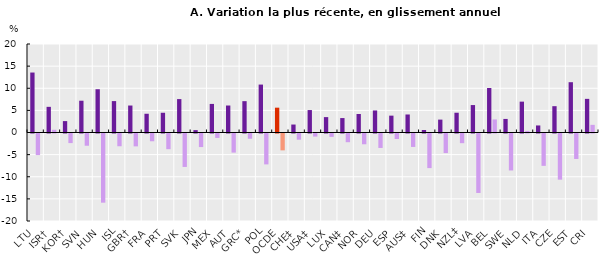
| Category | Salaire horaire nominal | Salaire horaire réel |
|---|---|---|
| LTU | 13.552 | -4.882 |
| ISR† | 5.798 | 0.612 |
| KOR† | 2.577 | -2.166 |
| SVN | 7.183 | -2.766 |
| HUN | 9.777 | -15.632 |
| ISL | 7.099 | -2.883 |
| GBR† | 6.096 | -2.909 |
| FRA | 4.235 | -1.755 |
| PRT | 4.462 | -3.547 |
| SVK | 7.551 | -7.557 |
| JPN | 0.54 | -3.065 |
| MEX | 6.46 | -0.997 |
| AUT | 6.099 | -4.316 |
| GRC* | 7.084 | -1.188 |
| POL | 10.832 | -6.979 |
| OCDE | 5.61 | -3.81 |
| CHE‡ | 1.8 | -1.399 |
| USA‡ | 5.072 | -0.697 |
| LUX | 3.477 | -0.762 |
| CAN‡ | 3.262 | -1.967 |
| NOR | 4.183 | -2.434 |
| DEU | 4.98 | -3.267 |
| ESP | 3.809 | -1.245 |
| AUS‡ | 4.071 | -3.037 |
| FIN | 0.57 | -7.819 |
| DNK | 2.913 | -4.422 |
| NZL‡ | 4.467 | -2.188 |
| LVA | 6.201 | -13.44 |
| BEL | 10.057 | 2.95 |
| SWE | 3.065 | -8.353 |
| NLD | 6.974 | 0.355 |
| ITA | 1.592 | -7.31 |
| CZE | 5.949 | -10.432 |
| EST | 11.368 | -5.755 |
| CRI | 7.601 | 1.729 |